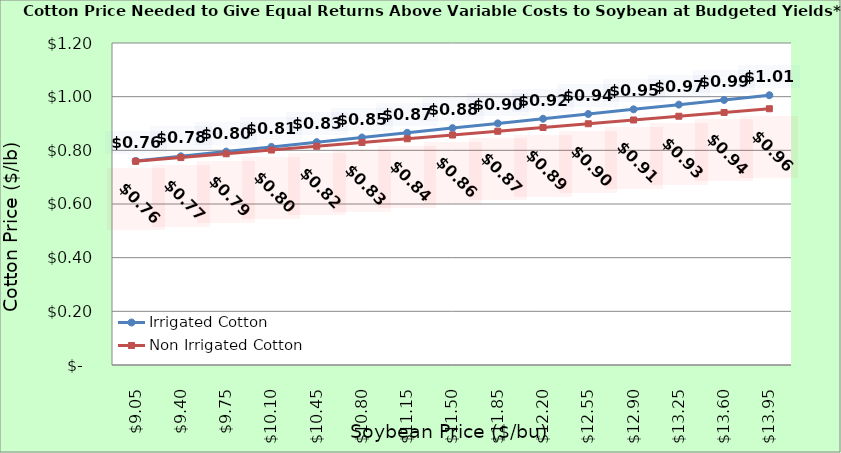
| Category | Irrigated Cotton | Non Irrigated Cotton |
|---|---|---|
| 9.050000000000002 | 0.76 | 0.759 |
| 9.400000000000002 | 0.778 | 0.773 |
| 9.750000000000002 | 0.795 | 0.787 |
| 10.100000000000001 | 0.813 | 0.801 |
| 10.450000000000001 | 0.83 | 0.815 |
| 10.8 | 0.848 | 0.829 |
| 11.15 | 0.865 | 0.843 |
| 11.5 | 0.883 | 0.857 |
| 11.85 | 0.9 | 0.871 |
| 12.2 | 0.918 | 0.885 |
| 12.549999999999999 | 0.935 | 0.899 |
| 12.899999999999999 | 0.953 | 0.913 |
| 13.249999999999998 | 0.97 | 0.927 |
| 13.599999999999998 | 0.988 | 0.941 |
| 13.949999999999998 | 1.005 | 0.955 |